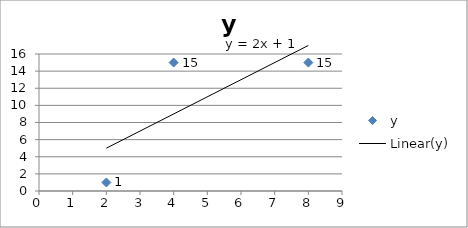
| Category | y |
|---|---|
| 2.0 | 1 |
| 4.0 | 15 |
| 8.0 | 15 |